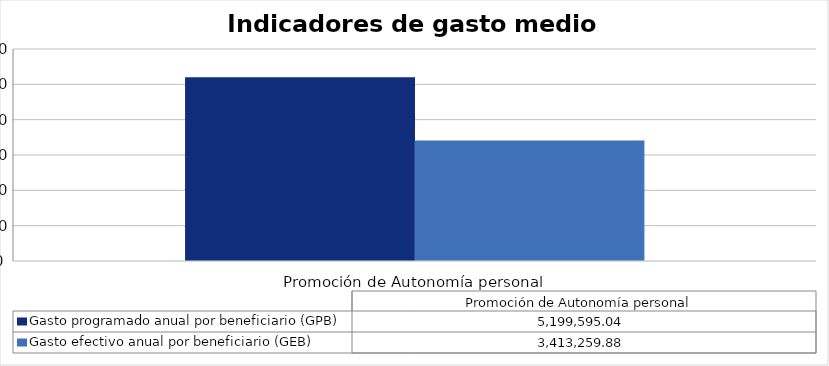
| Category | Gasto programado anual por beneficiario (GPB)  | Gasto efectivo anual por beneficiario (GEB)  |
|---|---|---|
| Promoción de Autonomía personal  | 5199595.04 | 3413259.882 |